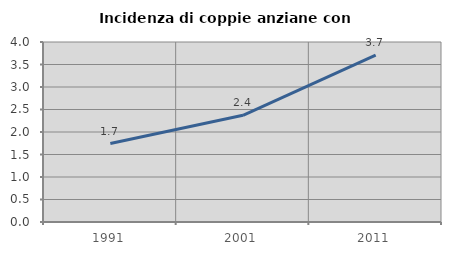
| Category | Incidenza di coppie anziane con figli |
|---|---|
| 1991.0 | 1.743 |
| 2001.0 | 2.371 |
| 2011.0 | 3.71 |